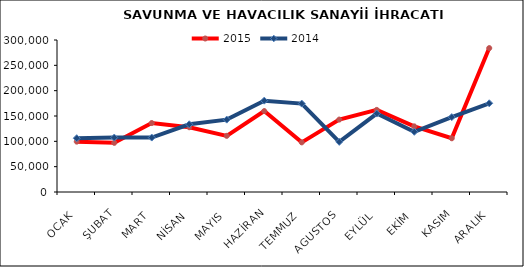
| Category | 2015 | 2014 |
|---|---|---|
| OCAK | 99405.477 | 106122.356 |
| ŞUBAT | 97020.905 | 107443.261 |
| MART | 136118.544 | 107438.487 |
| NİSAN | 127832.475 | 133668.089 |
| MAYIS | 110824.957 | 142827.799 |
| HAZİRAN | 159703.815 | 180261.736 |
| TEMMUZ | 97948.048 | 174457.046 |
| AGUSTOS | 142957.123 | 98979.868 |
| EYLÜL | 162049.919 | 154825.144 |
| EKİM | 129552.536 | 118879.573 |
| KASIM | 106033.681 | 147785.284 |
| ARALIK | 284038.211 | 175109.922 |